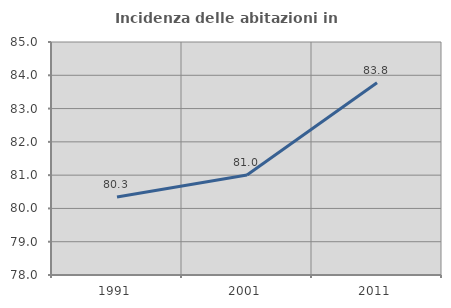
| Category | Incidenza delle abitazioni in proprietà  |
|---|---|
| 1991.0 | 80.342 |
| 2001.0 | 81.004 |
| 2011.0 | 83.777 |